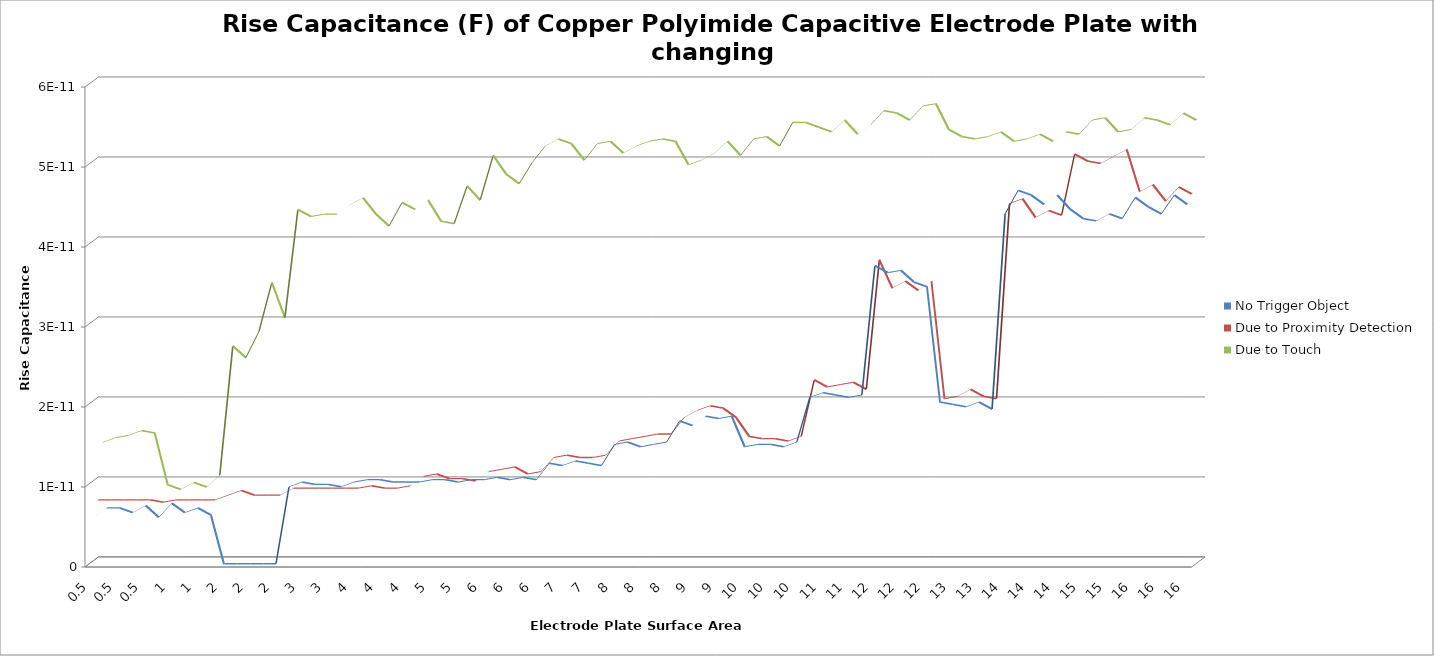
| Category | No Trigger Object | Due to Proximity Detection | Due to Touch |
|---|---|---|---|
| 0.5 | 0 | 0 | 0 |
| 0.5 | 0 | 0 | 0 |
| 0.5 | 0 | 0 | 0 |
| 0.5 | 0 | 0 | 0 |
| 0.5 | 0 | 0 | 0 |
| 1.0 | 0 | 0 | 0 |
| 1.0 | 0 | 0 | 0 |
| 1.0 | 0 | 0 | 0 |
| 1.0 | 0 | 0 | 0 |
| 1.0 | 0 | 0 | 0 |
| 2.0 | 0 | 0 | 0 |
| 2.0 | 0 | 0 | 0 |
| 2.0 | 0 | 0 | 0 |
| 2.0 | 0 | 0 | 0 |
| 2.0 | 0 | 0 | 0 |
| 3.0 | 0 | 0 | 0 |
| 3.0 | 0 | 0 | 0 |
| 3.0 | 0 | 0 | 0 |
| 3.0 | 0 | 0 | 0 |
| 3.0 | 0 | 0 | 0 |
| 4.0 | 0 | 0 | 0 |
| 4.0 | 0 | 0 | 0 |
| 4.0 | 0 | 0 | 0 |
| 4.0 | 0 | 0 | 0 |
| 4.0 | 0 | 0 | 0 |
| 5.0 | 0 | 0 | 0 |
| 5.0 | 0 | 0 | 0 |
| 5.0 | 0 | 0 | 0 |
| 5.0 | 0 | 0 | 0 |
| 5.0 | 0 | 0 | 0 |
| 6.0 | 0 | 0 | 0 |
| 6.0 | 0 | 0 | 0 |
| 6.0 | 0 | 0 | 0 |
| 6.0 | 0 | 0 | 0 |
| 6.0 | 0 | 0 | 0 |
| 7.0 | 0 | 0 | 0 |
| 7.0 | 0 | 0 | 0 |
| 7.0 | 0 | 0 | 0 |
| 7.0 | 0 | 0 | 0 |
| 7.0 | 0 | 0 | 0 |
| 8.0 | 0 | 0 | 0 |
| 8.0 | 0 | 0 | 0 |
| 8.0 | 0 | 0 | 0 |
| 8.0 | 0 | 0 | 0 |
| 8.0 | 0 | 0 | 0 |
| 9.0 | 0 | 0 | 0 |
| 9.0 | 0 | 0 | 0 |
| 9.0 | 0 | 0 | 0 |
| 9.0 | 0 | 0 | 0 |
| 9.0 | 0 | 0 | 0 |
| 10.0 | 0 | 0 | 0 |
| 10.0 | 0 | 0 | 0 |
| 10.0 | 0 | 0 | 0 |
| 10.0 | 0 | 0 | 0 |
| 10.0 | 0 | 0 | 0 |
| 11.0 | 0 | 0 | 0 |
| 11.0 | 0 | 0 | 0 |
| 11.0 | 0 | 0 | 0 |
| 11.0 | 0 | 0 | 0 |
| 11.0 | 0 | 0 | 0 |
| 12.0 | 0 | 0 | 0 |
| 12.0 | 0 | 0 | 0 |
| 12.0 | 0 | 0 | 0 |
| 12.0 | 0 | 0 | 0 |
| 12.0 | 0 | 0 | 0 |
| 13.0 | 0 | 0 | 0 |
| 13.0 | 0 | 0 | 0 |
| 13.0 | 0 | 0 | 0 |
| 13.0 | 0 | 0 | 0 |
| 13.0 | 0 | 0 | 0 |
| 14.0 | 0 | 0 | 0 |
| 14.0 | 0 | 0 | 0 |
| 14.0 | 0 | 0 | 0 |
| 14.0 | 0 | 0 | 0 |
| 14.0 | 0 | 0 | 0 |
| 15.0 | 0 | 0 | 0 |
| 15.0 | 0 | 0 | 0 |
| 15.0 | 0 | 0 | 0 |
| 15.0 | 0 | 0 | 0 |
| 15.0 | 0 | 0 | 0 |
| 16.0 | 0 | 0 | 0 |
| 16.0 | 0 | 0 | 0 |
| 16.0 | 0 | 0 | 0 |
| 16.0 | 0 | 0 | 0 |
| 16.0 | 0 | 0 | 0 |